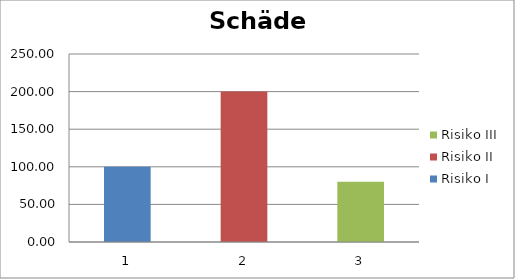
| Category | Risiko I | Risiko II | Risiko III |
|---|---|---|---|
| 0 | 100 | 0 | 0 |
| 1 | 0 | 200 | 0 |
| 2 | 0 | 0 | 80 |